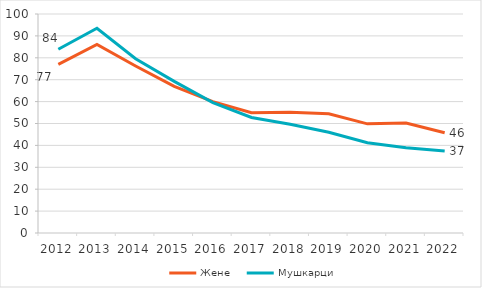
| Category | Жене  | Мушкарци |
|---|---|---|
| 2012.0 | 76.988 | 83.915 |
| 2013.0 | 86.068 | 93.489 |
| 2014.0 | 76.261 | 79.579 |
| 2015.0 | 66.948 | 69.226 |
| 2016.0 | 60.009 | 59.561 |
| 2017.0 | 54.949 | 52.754 |
| 2018.0 | 55.124 | 49.615 |
| 2019.0 | 54.458 | 45.997 |
| 2020.0 | 49.844 | 41.183 |
| 2021.0 | 50.203 | 38.965 |
| 2022.0 | 45.741 | 37.403 |